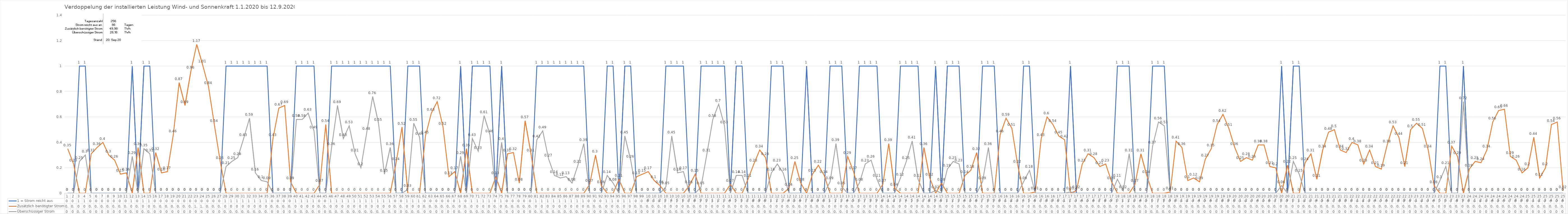
| Category | 1 = Strom reicht aus | Zusätzlich benötigter Strom | Überschüssiger Strom |
|---|---|---|---|
| 0 | 0 | 0.35 | 0 |
| 1 | 0 | 0.23 | 0 |
| 2 | 1 | 0 | 0.25 |
| 3 | 1 | 0 | 0.3 |
| 4 | 0 | 0.31 | 0 |
| 5 | 0 | 0.36 | 0 |
| 6 | 0 | 0.4 | 0 |
| 7 | 0 | 0.3 | 0 |
| 8 | 0 | 0.26 | 0 |
| 9 | 0 | 0.15 | 0 |
| 10 | 0 | 0.16 | 0 |
| 11 | 1 | 0 | 0.29 |
| 12 | 0 | 0.36 | 0 |
| 13 | 1 | 0 | 0.35 |
| 14 | 1 | 0 | 0.31 |
| 15 | 0 | 0.32 | 0 |
| 16 | 0 | 0.16 | 0 |
| 17 | 0 | 0.17 | 0 |
| 18 | 0 | 0.46 | 0 |
| 19 | 0 | 0.87 | 0 |
| 20 | 0 | 0.69 | 0 |
| 21 | 0 | 0.96 | 0 |
| 22 | 0 | 1.17 | 0 |
| 23 | 0 | 1.01 | 0 |
| 24 | 0 | 0.84 | 0 |
| 25 | 0 | 0.54 | 0 |
| 26 | 0 | 0.25 | 0 |
| 27 | 1 | 0 | 0.21 |
| 28 | 1 | 0 | 0.25 |
| 29 | 1 | 0 | 0.28 |
| 30 | 1 | 0 | 0.43 |
| 31 | 1 | 0 | 0.59 |
| 32 | 1 | 0 | 0.16 |
| 33 | 1 | 0 | 0.1 |
| 34 | 1 | 0 | 0.09 |
| 35 | 0 | 0.43 | 0 |
| 36 | 0 | 0.67 | 0 |
| 37 | 0 | 0.69 | 0 |
| 38 | 0 | 0.09 | 0 |
| 39 | 1 | 0 | 0.58 |
| 40 | 1 | 0 | 0.58 |
| 41 | 1 | 0 | 0.63 |
| 42 | 1 | 0 | 0.49 |
| 43 | 0 | 0.07 | 0 |
| 44 | 0 | 0.54 | 0 |
| 45 | 1 | 0 | 0.36 |
| 46 | 1 | 0 | 0.69 |
| 47 | 1 | 0 | 0.43 |
| 48 | 1 | 0 | 0.53 |
| 49 | 1 | 0 | 0.31 |
| 50 | 1 | 0 | 0.2 |
| 51 | 1 | 0 | 0.48 |
| 52 | 1 | 0 | 0.76 |
| 53 | 1 | 0 | 0.55 |
| 54 | 1 | 0 | 0.15 |
| 55 | 1 | 0 | 0.36 |
| 56 | 0 | 0.24 | 0 |
| 57 | 0 | 0.52 | 0 |
| 58 | 1 | 0 | 0.03 |
| 59 | 1 | 0 | 0.55 |
| 60 | 1 | 0 | 0.44 |
| 61 | 0 | 0.45 | 0 |
| 62 | 0 | 0.63 | 0 |
| 63 | 0 | 0.72 | 0 |
| 64 | 0 | 0.52 | 0 |
| 65 | 0 | 0.13 | 0 |
| 66 | 0 | 0.17 | 0 |
| 67 | 1 | 0 | 0.29 |
| 68 | 0 | 0.35 | 0 |
| 69 | 1 | 0 | 0.43 |
| 70 | 1 | 0 | 0.33 |
| 71 | 1 | 0 | 0.61 |
| 72 | 1 | 0 | 0.46 |
| 73 | 0 | 0.13 | 0 |
| 74 | 1 | 0 | 0.4 |
| 75 | 0 | 0.31 | 0 |
| 76 | 0 | 0.32 | 0 |
| 77 | 0 | 0.08 | 0 |
| 78 | 0 | 0.57 | 0 |
| 79 | 0 | 0.31 | 0 |
| 80 | 1 | 0 | 0.42 |
| 81 | 1 | 0 | 0.49 |
| 82 | 1 | 0 | 0.27 |
| 83 | 1 | 0 | 0.14 |
| 84 | 1 | 0 | 0.12 |
| 85 | 1 | 0 | 0.13 |
| 86 | 1 | 0 | 0.08 |
| 87 | 1 | 0 | 0.22 |
| 88 | 1 | 0 | 0.39 |
| 89 | 0 | 0.07 | 0 |
| 90 | 0 | 0.3 | 0 |
| 91 | 0 | 0.06 | 0 |
| 92 | 1 | 0 | 0.14 |
| 93 | 1 | 0 | 0.08 |
| 94 | 0 | 0.11 | 0 |
| 95 | 1 | 0 | 0.45 |
| 96 | 1 | 0 | 0.26 |
| 97 | 0 | 0.13 | 0 |
| 98 | 0 | 0.15 | 0 |
| 99 | 0 | 0.17 | 0 |
| 100 | 0 | 0.1 | 0 |
| 101 | 0 | 0.06 | 0 |
| 102 | 1 | 0 | 0.05 |
| 103 | 1 | 0 | 0.45 |
| 104 | 1 | 0 | 0.16 |
| 105 | 1 | 0 | 0.17 |
| 106 | 0 | 0.06 | 0 |
| 107 | 0 | 0.15 | 0 |
| 108 | 1 | 0 | 0.05 |
| 109 | 1 | 0 | 0.31 |
| 110 | 1 | 0 | 0.58 |
| 111 | 1 | 0 | 0.7 |
| 112 | 1 | 0 | 0.53 |
| 113 | 0 | 0.07 | 0 |
| 114 | 1 | 0 | 0.14 |
| 115 | 1 | 0 | 0.14 |
| 116 | 0 | 0.11 | 0 |
| 117 | 0 | 0.23 | 0 |
| 118 | 0 | 0.34 | 0 |
| 119 | 0 | 0.28 | 0 |
| 120 | 1 | 0 | 0.16 |
| 121 | 1 | 0 | 0.23 |
| 122 | 1 | 0 | 0.16 |
| 123 | 0 | 0.04 | 0 |
| 124 | 0 | 0.25 | 0 |
| 125 | 0 | 0.08 | 0 |
| 126 | 1 | 0 | 0 |
| 127 | 0 | 0.15 | 0 |
| 128 | 0 | 0.22 | 0 |
| 129 | 0 | 0.14 | 0 |
| 130 | 1 | 0 | 0.09 |
| 131 | 1 | 0 | 0.39 |
| 132 | 1 | 0 | 0.05 |
| 133 | 0 | 0.29 | 0 |
| 134 | 0 | 0.17 | 0 |
| 135 | 1 | 0 | 0.08 |
| 136 | 1 | 0 | 0.23 |
| 137 | 1 | 0 | 0.26 |
| 138 | 1 | 0 | 0.11 |
| 139 | 0 | 0.07 | 0 |
| 140 | 0 | 0.39 | 0 |
| 141 | 0 | 0.04 | 0 |
| 142 | 1 | 0 | 0.12 |
| 143 | 1 | 0 | 0.25 |
| 144 | 1 | 0 | 0.41 |
| 145 | 1 | 0 | 0.11 |
| 146 | 0 | 0.36 | 0 |
| 147 | 0 | 0.12 | 0 |
| 148 | 1 | 0 | 0.02 |
| 149 | 0 | 0.08 | 0 |
| 150 | 1 | 0 | 0.19 |
| 151 | 1 | 0 | 0.25 |
| 152 | 1 | 0 | 0.23 |
| 153 | 0 | 0.14 | 0 |
| 154 | 0 | 0.18 | 0 |
| 155 | 0 | 0.32 | 0 |
| 156 | 1 | 0 | 0.09 |
| 157 | 1 | 0 | 0.36 |
| 158 | 1 | 0 | 0 |
| 159 | 0 | 0.46 | 0 |
| 160 | 0 | 0.59 | 0 |
| 161 | 0 | 0.51 | 0 |
| 162 | 0 | 0.22 | 0 |
| 163 | 1 | 0 | 0.09 |
| 164 | 1 | 0 | 0.18 |
| 165 | 0 | 0.01 | 0 |
| 166 | 0 | 0.43 | 0 |
| 167 | 0 | 0.6 | 0 |
| 168 | 0 | 0.54 | 0 |
| 169 | 0 | 0.45 | 0 |
| 170 | 0 | 0.42 | 0 |
| 171 | 1 | 0 | 0.01 |
| 172 | 0 | 0.02 | 0 |
| 173 | 0 | 0.23 | 0 |
| 174 | 0 | 0.31 | 0 |
| 175 | 0 | 0.28 | 0 |
| 176 | 0 | 0.21 | 0 |
| 177 | 0 | 0.23 | 0 |
| 178 | 0 | 0.09 | 0 |
| 179 | 1 | 0 | 0.11 |
| 180 | 1 | 0 | 0.02 |
| 181 | 1 | 0 | 0.31 |
| 182 | 0 | 0.07 | 0 |
| 183 | 0 | 0.31 | 0 |
| 184 | 0 | 0.14 | 0 |
| 185 | 1 | 0 | 0.37 |
| 186 | 1 | 0 | 0.56 |
| 187 | 1 | 0 | 0.53 |
| 188 | 0 | 0.01 | 0 |
| 189 | 0 | 0.41 | 0 |
| 190 | 0 | 0.36 | 0 |
| 191 | 0 | 0.1 | 0 |
| 192 | 0 | 0.12 | 0 |
| 193 | 0 | 0.09 | 0 |
| 194 | 0 | 0.27 | 0 |
| 195 | 0 | 0.35 | 0 |
| 196 | 0 | 0.54 | 0 |
| 197 | 0 | 0.62 | 0 |
| 198 | 0 | 0.51 | 0 |
| 199 | 0 | 0.36 | 0 |
| 200 | 0 | 0.25 | 0 |
| 201 | 0 | 0.28 | 0 |
| 202 | 0 | 0.26 | 0 |
| 203 | 0 | 0.38 | 0 |
| 204 | 0 | 0.38 | 0 |
| 205 | 0 | 0.21 | 0 |
| 206 | 0 | 0.2 | 0 |
| 207 | 1 | 0 | 0.06 |
| 208 | 0 | 0.22 | 0 |
| 209 | 1 | 0 | 0.25 |
| 210 | 1 | 0 | 0.15 |
| 211 | 0 | 0.24 | 0 |
| 212 | 0 | 0.31 | 0 |
| 213 | 0 | 0.11 | 0 |
| 214 | 0 | 0.34 | 0 |
| 215 | 0 | 0.48 | 0 |
| 216 | 0 | 0.5 | 0 |
| 217 | 0 | 0.34 | 0 |
| 218 | 0 | 0.32 | 0 |
| 219 | 0 | 0.4 | 0 |
| 220 | 0 | 0.38 | 0 |
| 221 | 0 | 0.23 | 0 |
| 222 | 0 | 0.34 | 0 |
| 223 | 0 | 0.21 | 0 |
| 224 | 0 | 0.19 | 0 |
| 225 | 0 | 0.38 | 0 |
| 226 | 0 | 0.53 | 0 |
| 227 | 0 | 0.44 | 0 |
| 228 | 0 | 0.21 | 0 |
| 229 | 0 | 0.5 | 0 |
| 230 | 0 | 0.55 | 0 |
| 231 | 0 | 0.51 | 0 |
| 232 | 0 | 0.34 | 0 |
| 233 | 0 | 0.06 | 0 |
| 234 | 1 | 0 | 0.1 |
| 235 | 1 | 0 | 0.21 |
| 236 | 0 | 0.37 | 0 |
| 237 | 0 | 0.29 | 0 |
| 238 | 1 | 0 | 0.72 |
| 239 | 0 | 0.19 | 0 |
| 240 | 0 | 0.25 | 0 |
| 241 | 0 | 0.24 | 0 |
| 242 | 0 | 0.34 | 0 |
| 243 | 0 | 0.56 | 0 |
| 244 | 0 | 0.65 | 0 |
| 245 | 0 | 0.66 | 0 |
| 246 | 0 | 0.29 | 0 |
| 247 | 0 | 0.26 | 0 |
| 248 | 0 | 0.16 | 0 |
| 249 | 0 | 0.2 | 0 |
| 250 | 0 | 0.44 | 0 |
| 251 | 0 | 0.12 | 0 |
| 252 | 0 | 0.2 | 0 |
| 253 | 0 | 0.54 | 0 |
| 254 | 0 | 0.56 | 0 |
| 255 | 0 | 0.02 | 0 |